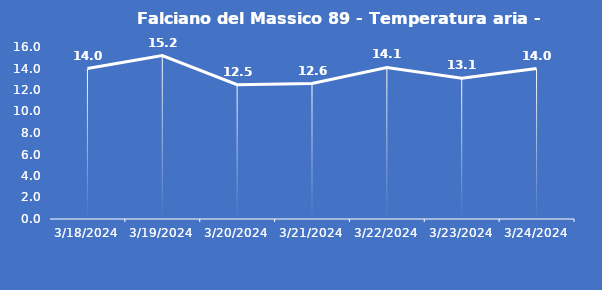
| Category | Falciano del Massico 89 - Temperatura aria - Grezzo (°C) |
|---|---|
| 3/18/24 | 14 |
| 3/19/24 | 15.2 |
| 3/20/24 | 12.5 |
| 3/21/24 | 12.6 |
| 3/22/24 | 14.1 |
| 3/23/24 | 13.1 |
| 3/24/24 | 14 |